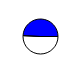
| Category | Series 0 |
|---|---|
| 0 | 7598877 |
| 1 | 7370898 |